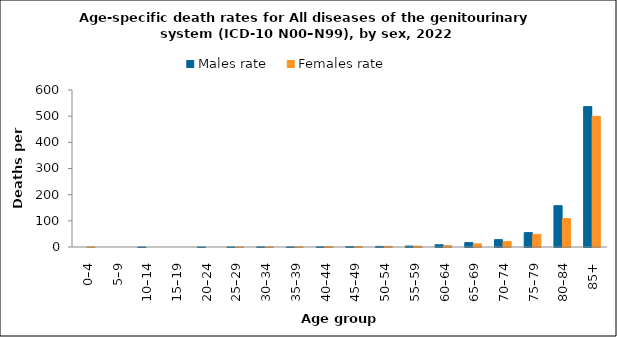
| Category | Males rate | Females rate |
|---|---|---|
| 0–4 | 0 | 0.136 |
| 5–9 | 0 | 0 |
| 10–14 | 0.119 | 0 |
| 15–19 | 0 | 0 |
| 20–24 | 0.118 | 0 |
| 25–29 | 0.216 | 0.111 |
| 30–34 | 0.528 | 0.31 |
| 35–39 | 0.213 | 0.419 |
| 40–44 | 0.713 | 1.159 |
| 45–49 | 1.743 | 1.098 |
| 50–54 | 2.334 | 2.62 |
| 55–59 | 3.578 | 3.204 |
| 60–64 | 8.546 | 5.085 |
| 65–69 | 16.897 | 11.989 |
| 70–74 | 28.122 | 21.053 |
| 75–79 | 54.936 | 48.44 |
| 80–84 | 157.903 | 108.786 |
| 85+ | 536.561 | 499.458 |